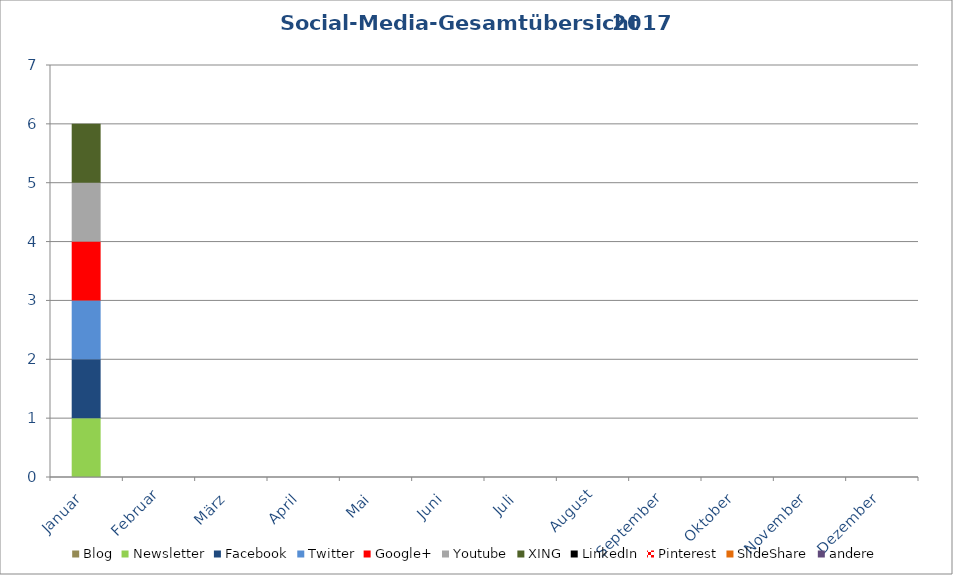
| Category | Blog | Newsletter | Facebook | Twitter | Google+ | Youtube | XING | LinkedIn | Pinterest | SlideShare | andere |
|---|---|---|---|---|---|---|---|---|---|---|---|
| Januar | 0 | 1 | 1 | 1 | 1 | 1 | 1 | 0 | 0 | 0 | 0 |
| Februar | 0 | 0 | 0 | 0 | 0 | 0 | 0 | 0 | 0 | 0 | 0 |
| März | 0 | 0 | 0 | 0 | 0 | 0 | 0 | 0 | 0 | 0 | 0 |
| April | 0 | 0 | 0 | 0 | 0 | 0 | 0 | 0 | 0 | 0 | 0 |
| Mai | 0 | 0 | 0 | 0 | 0 | 0 | 0 | 0 | 0 | 0 | 0 |
| Juni | 0 | 0 | 0 | 0 | 0 | 0 | 0 | 0 | 0 | 0 | 0 |
| Juli | 0 | 0 | 0 | 0 | 0 | 0 | 0 | 0 | 0 | 0 | 0 |
| August | 0 | 0 | 0 | 0 | 0 | 0 | 0 | 0 | 0 | 0 | 0 |
| September | 0 | 0 | 0 | 0 | 0 | 0 | 0 | 0 | 0 | 0 | 0 |
| Oktober | 0 | 0 | 0 | 0 | 0 | 0 | 0 | 0 | 0 | 0 | 0 |
| November | 0 | 0 | 0 | 0 | 0 | 0 | 0 | 0 | 0 | 0 | 0 |
| Dezember | 0 | 0 | 0 | 0 | 0 | 0 | 0 | 0 | 0 | 0 | 0 |